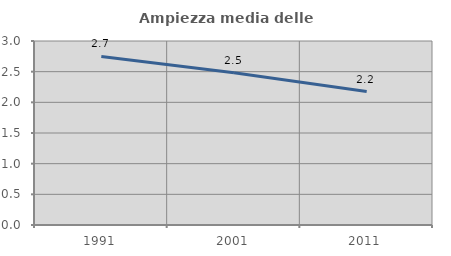
| Category | Ampiezza media delle famiglie |
|---|---|
| 1991.0 | 2.748 |
| 2001.0 | 2.481 |
| 2011.0 | 2.176 |